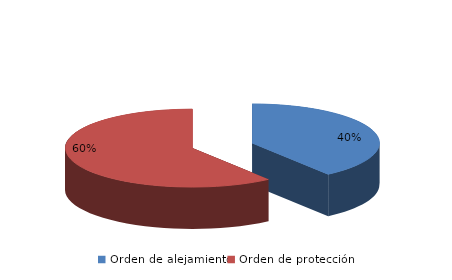
| Category | Series 0 |
|---|---|
| Orden de alejamiento | 123 |
| Orden de protección | 186 |